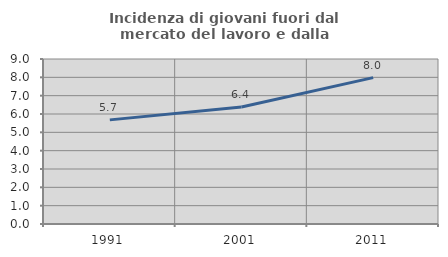
| Category | Incidenza di giovani fuori dal mercato del lavoro e dalla formazione  |
|---|---|
| 1991.0 | 5.68 |
| 2001.0 | 6.379 |
| 2011.0 | 7.982 |